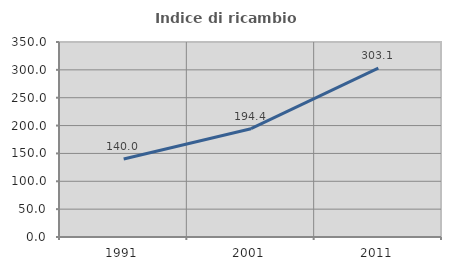
| Category | Indice di ricambio occupazionale  |
|---|---|
| 1991.0 | 140 |
| 2001.0 | 194.366 |
| 2011.0 | 303.125 |